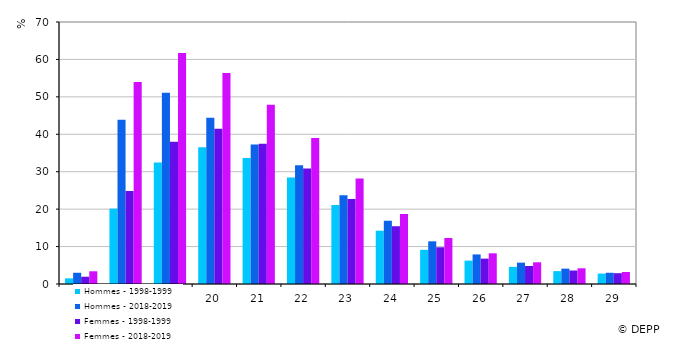
| Category | Hommes - 1998-1999 | Hommes - 2018-2019 | Femmes - 1998-1999 | Femmes - 2018-2019 |
|---|---|---|---|---|
| 17.0 | 1.509 | 3 | 1.944 | 3.4 |
| 18.0 | 20.142 | 43.9 | 24.86 | 54 |
| 19.0 | 32.485 | 51.1 | 38.022 | 61.7 |
| 20.0 | 36.568 | 44.4 | 41.505 | 56.4 |
| 21.0 | 33.632 | 37.3 | 37.447 | 47.9 |
| 22.0 | 28.453 | 31.7 | 30.884 | 39 |
| 23.0 | 21.11 | 23.7 | 22.737 | 28.2 |
| 24.0 | 14.242 | 16.9 | 15.435 | 18.7 |
| 25.0 | 9.132 | 11.4 | 9.816 | 12.3 |
| 26.0 | 6.248 | 7.9 | 6.783 | 8.2 |
| 27.0 | 4.578 | 5.7 | 4.807 | 5.8 |
| 28.0 | 3.447 | 4.1 | 3.609 | 4.2 |
| 29.0 | 2.785 | 3 | 2.889 | 3.2 |